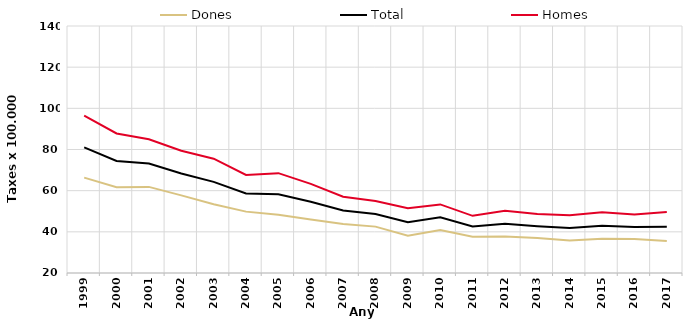
| Category | Dones | Total | Homes |
|---|---|---|---|
| 1999.0 | 66.329 | 81.045 | 96.47 |
| 2000.0 | 61.701 | 74.45 | 87.8 |
| 2001.0 | 61.835 | 73.163 | 85.001 |
| 2002.0 | 57.714 | 68.345 | 79.366 |
| 2003.0 | 53.387 | 64.292 | 75.547 |
| 2004.0 | 49.819 | 58.62 | 67.671 |
| 2005.0 | 48.312 | 58.295 | 68.517 |
| 2006.0 | 46.039 | 54.571 | 63.284 |
| 2007.0 | 43.84 | 50.402 | 57.088 |
| 2008.0 | 42.534 | 48.707 | 54.983 |
| 2009.0 | 38.06 | 44.69 | 51.45 |
| 2010.0 | 40.86 | 47.03 | 53.32 |
| 2011.0 | 37.65 | 42.65 | 47.77 |
| 2012.0 | 37.73 | 43.92 | 50.29 |
| 2013.0 | 36.96 | 42.72 | 48.66 |
| 2014.0 | 35.78 | 41.82 | 48.09 |
| 2015.0 | 36.69 | 42.95 | 49.46 |
| 2016.0 | 36.54 | 42.36 | 48.41 |
| 2017.0 | 35.58 | 42.45 | 49.6 |